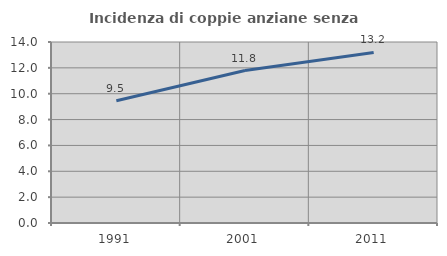
| Category | Incidenza di coppie anziane senza figli  |
|---|---|
| 1991.0 | 9.459 |
| 2001.0 | 11.793 |
| 2011.0 | 13.191 |